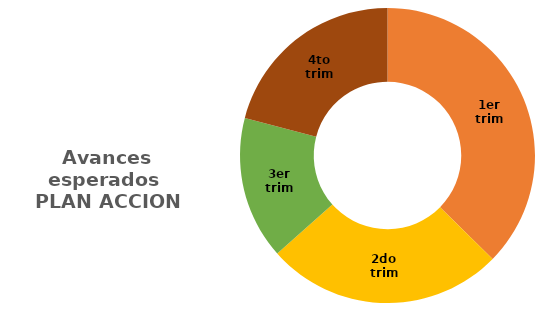
| Category | Series 0 |
|---|---|
| 1er trim | 0.375 |
| 2do trim | 0.261 |
| 3er trim | 0.157 |
| 4to trim | 0.21 |